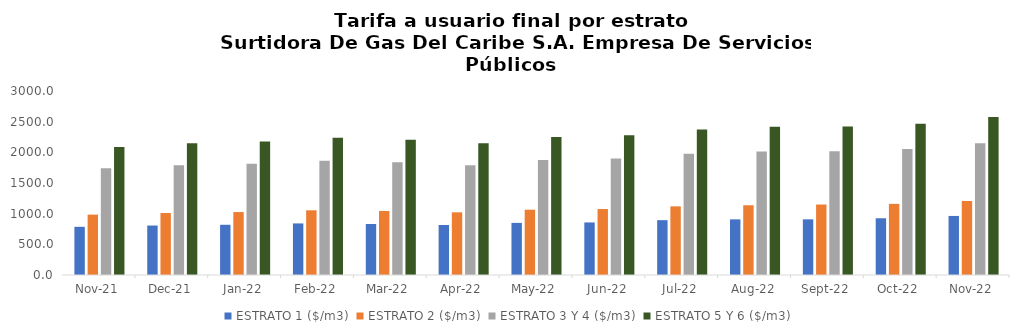
| Category | ESTRATO 1 ($/m3) | ESTRATO 2 ($/m3) | ESTRATO 3 Y 4 ($/m3) | ESTRATO 5 Y 6 ($/m3) |
|---|---|---|---|---|
| 2021-11-01 | 785.55 | 984.37 | 1739.24 | 2087.088 |
| 2021-12-01 | 806.47 | 1011.33 | 1789.2 | 2147.04 |
| 2022-01-01 | 818.77 | 1026.2 | 1814.11 | 2176.932 |
| 2022-02-01 | 840.84 | 1054.98 | 1864.59 | 2237.508 |
| 2022-03-01 | 831.68 | 1043.33 | 1838.57 | 2206.284 |
| 2022-04-01 | 815.29 | 1022.06 | 1790.68 | 2148.816 |
| 2022-05-01 | 849.49 | 1064.9 | 1874.06 | 2248.872 |
| 2022-06-01 | 856.82 | 1075.55 | 1900.19 | 2280.228 |
| 2022-07-01 | 894.13 | 1119.13 | 1978.46 | 2374.152 |
| 2022-08-01 | 907.16 | 1137.37 | 2014.17 | 2417.004 |
| 2022-09-01 | 907.44 | 1149 | 2018.96 | 2422.8 |
| 2022-10-01 | 924.96 | 1159.68 | 2054.17 | 2465.004 |
| 2022-11-01 | 962.82 | 1206.32 | 2147.73 | 2577.276 |